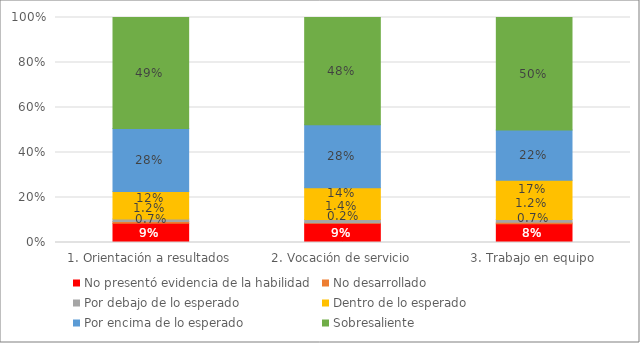
| Category | No presentó evidencia de la habilidad | No desarrollado | Por debajo de lo esperado | Dentro de lo esperado | Por encima de lo esperado | Sobresaliente |
|---|---|---|---|---|---|---|
| 1. Orientación a resultados | 0.086 | 0.007 | 0.012 | 0.121 | 0.281 | 0.493 |
| 2. Vocación de servicio | 0.086 | 0.002 | 0.014 | 0.14 | 0.281 | 0.476 |
| 3. Trabajo en equipo | 0.083 | 0.007 | 0.012 | 0.174 | 0.224 | 0.5 |